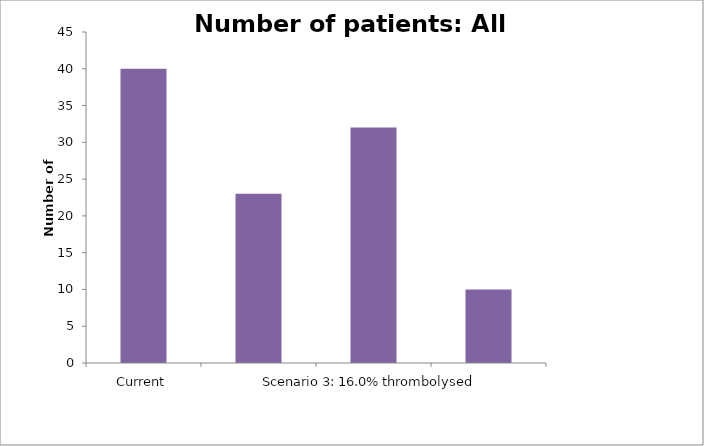
| Category | Number of patients thromboylsed |
|---|---|
| Current | 40 |
| Scenario 2: 20% thrombolysed | 23 |
| Scenario 3: 16.0% thrombolysed | 32 |
| Scenario 4: Setting a new level of patients thrombolysed | 10 |